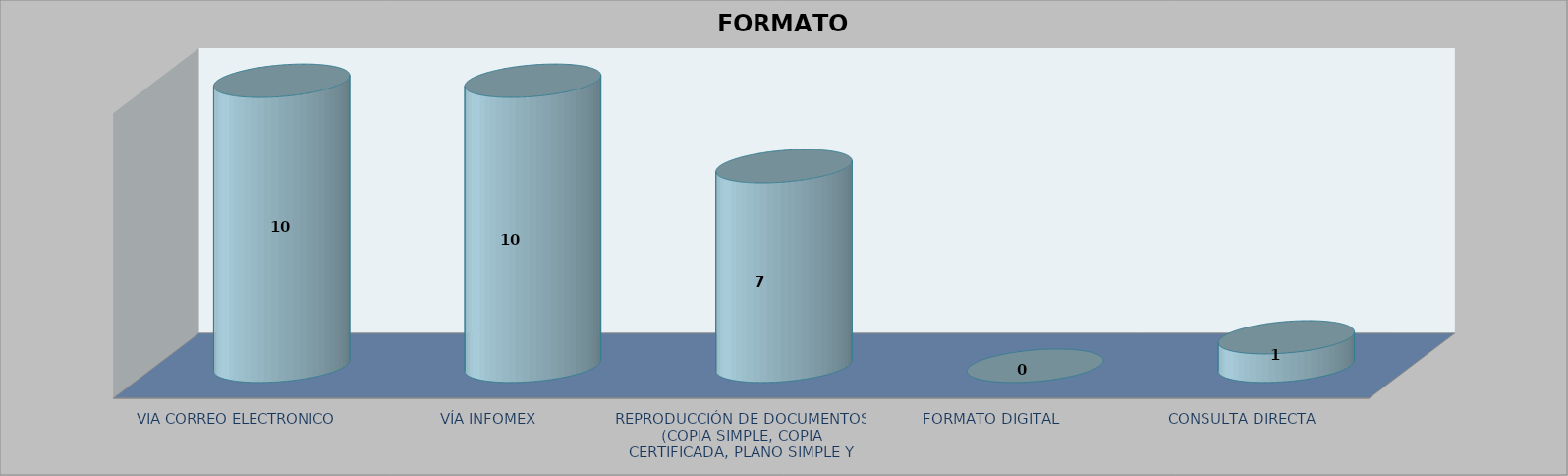
| Category |        FORMATO SOLICITADO | Series 1 | Series 2 |
|---|---|---|---|
| VIA CORREO ELECTRONICO |  |  | 10 |
| VÍA INFOMEX |  |  | 10 |
| REPRODUCCIÓN DE DOCUMENTOS (COPIA SIMPLE, COPIA CERTIFICADA, PLANO SIMPLE Y PLANO CERTIFICADO) |  |  | 7 |
| FORMATO DIGITAL |  |  | 0 |
| CONSULTA DIRECTA |  |  | 1 |